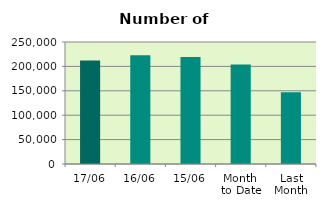
| Category | Series 0 |
|---|---|
| 17/06 | 211954 |
| 16/06 | 223094 |
| 15/06 | 219510 |
| Month 
to Date | 203989.077 |
| Last
Month | 147277.8 |